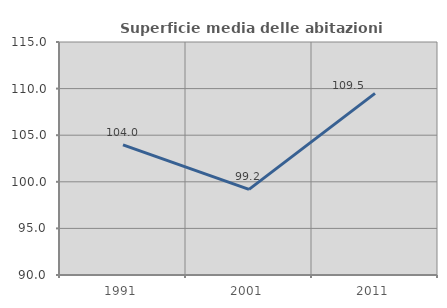
| Category | Superficie media delle abitazioni occupate |
|---|---|
| 1991.0 | 103.961 |
| 2001.0 | 99.192 |
| 2011.0 | 109.485 |